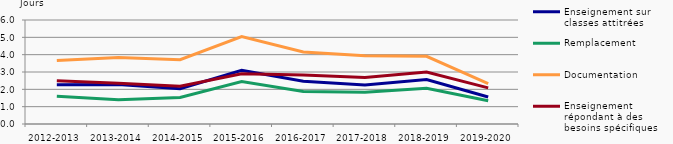
| Category | Enseignement sur classes attitrées | Remplacement | Documentation | Enseignement répondant à des besoins spécifiques |
|---|---|---|---|---|
| 2012-2013 | 2.26 | 1.6 | 3.668 | 2.488 |
| 2013-2014 | 2.282 | 1.403 | 3.842 | 2.357 |
| 2014-2015 | 2.039 | 1.535 | 3.71 | 2.184 |
| 2015-2016 | 3.102 | 2.456 | 5.042 | 2.903 |
| 2016-2017 | 2.472 | 1.88 | 4.153 | 2.831 |
| 2017-2018 | 2.25 | 1.828 | 3.938 | 2.683 |
| 2018-2019 | 2.563 | 2.059 | 3.905 | 3.004 |
| 2019-2020 | 1.558 | 1.338 | 2.336 | 2.084 |